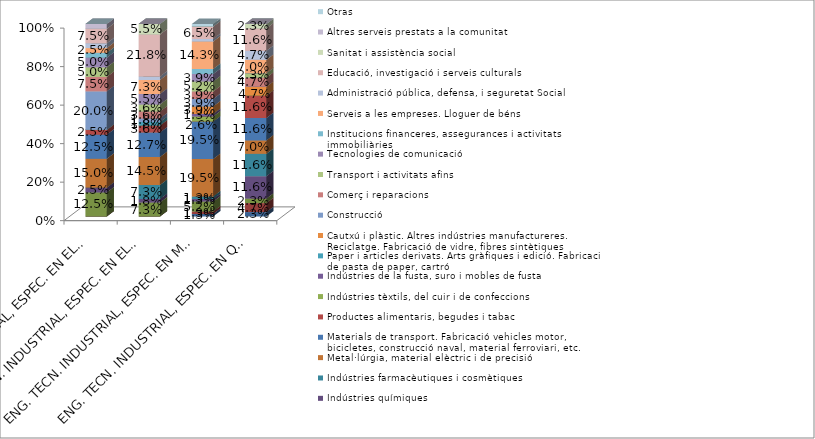
| Category | Agricultura, ramaderia, silvicultura, caça | Comb. Sòlids, petroli, gas i minerals radioactius | Electricitat, gas i aigua. Fabricació de generadors de vapor, captació, depuració i distribució d'aigua | Indústries químiques | Indústries farmacèutiques i cosmètiques | Metal·lúrgia, material elèctric i de precisió | Materials de transport. Fabricació vehicles motor, bicicletes, construcció naval, material ferroviari, etc. | Productes alimentaris, begudes i tabac | Indústries tèxtils, del cuir i de confeccions | Indústries de la fusta, suro i mobles de fusta | Paper i articles derivats. Arts gràfiques i edició. Fabricació de pasta de paper, cartró | Cautxú i plàstic. Altres indústries manufactureres. Reciclatge. Fabricació de vidre, fibres sintètiques | Construcció | Comerç i reparacions | Transport i activitats afins | Tecnologies de comunicació | Institucions financeres, assegurances i activitats immobiliàries | Serveis a les empreses. Lloguer de béns | Administració pública, defensa, i seguretat Social | Educació, investigació i serveis culturals | Sanitat i assistència social | Altres serveis prestats a la comunitat | Otras |
|---|---|---|---|---|---|---|---|---|---|---|---|---|---|---|---|---|---|---|---|---|---|---|---|
| ENG. TECN. INDUSTRIAL, ESPEC. EN ELECTRICITAT | 0 | 0 | 0.125 | 0.025 | 0 | 0.15 | 0.125 | 0.025 | 0 | 0 | 0 | 0 | 0.2 | 0.075 | 0.05 | 0.05 | 0.025 | 0.025 | 0.025 | 0.075 | 0 | 0.025 | 0 |
| ENG. TECN. INDUSTRIAL, ESPEC. EN ELECTRONICA INDUSTRIAL | 0 | 0 | 0.073 | 0.018 | 0.073 | 0.145 | 0.127 | 0.036 | 0 | 0 | 0.018 | 0 | 0.018 | 0.036 | 0.036 | 0.055 | 0 | 0.073 | 0.018 | 0.218 | 0.055 | 0 | 0 |
| ENG. TECN. INDUSTRIAL, ESPEC. EN MECANICA | 0.013 | 0.013 | 0.052 | 0.013 | 0.013 | 0.195 | 0.195 | 0 | 0.026 | 0.013 | 0 | 0.039 | 0.039 | 0.039 | 0.052 | 0.039 | 0.026 | 0.143 | 0.013 | 0.065 | 0 | 0 | 0.013 |
| ENG. TECN. INDUSTRIAL, ESPEC. EN QUÍMICA INDUSTRIAL | 0.023 | 0.047 | 0.023 | 0.116 | 0.116 | 0.07 | 0.116 | 0.116 | 0 | 0 | 0 | 0.047 | 0 | 0.047 | 0.023 | 0 | 0 | 0.07 | 0.047 | 0.116 | 0.023 | 0 | 0 |